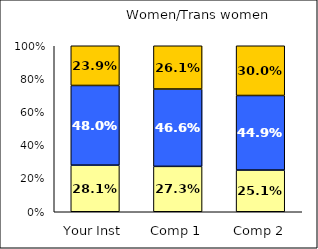
| Category | Low Habits of Mind | Average Habits of Mind | High Habits of Mind |
|---|---|---|---|
| Your Inst | 0.281 | 0.48 | 0.239 |
| Comp 1 | 0.273 | 0.466 | 0.261 |
| Comp 2 | 0.251 | 0.449 | 0.3 |